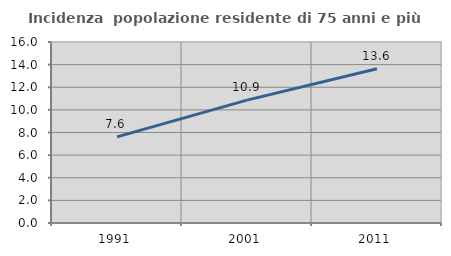
| Category | Incidenza  popolazione residente di 75 anni e più |
|---|---|
| 1991.0 | 7.61 |
| 2001.0 | 10.859 |
| 2011.0 | 13.636 |